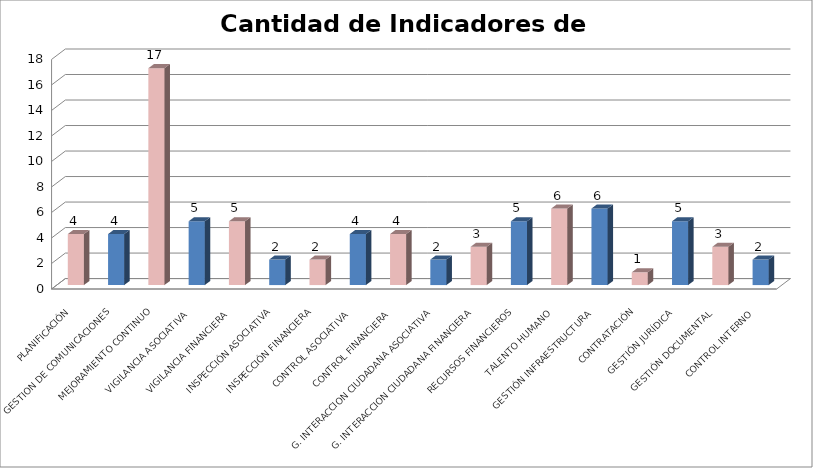
| Category | Series 0 |
|---|---|
| PLANIFICACIÓN | 4 |
| GESTION DE COMUNICACIONES | 4 |
| MEJORAMIENTO CONTINUO | 17 |
| VIGILANCIA ASOCIATIVA | 5 |
| VIGILANCIA FINANCIERA | 5 |
| INSPECCIÓN ASOCIATIVA | 2 |
| INSPECCIÓN FINANCIERA | 2 |
| CONTROL ASOCIATIVA | 4 |
| CONTROL FINANCIERA | 4 |
| G. INTERACCION CIUDADANA ASOCIATIVA | 2 |
| G. INTERACCION CIUDADANA FINANCIERA | 3 |
| RECURSOS FINANCIEROS | 5 |
| TALENTO HUMANO | 6 |
| GESTIÓN INFRAESTRUCTURA | 6 |
| CONTRATACIÓN | 1 |
| GESTIÓN JURÍDICA | 5 |
| GESTIÓN DOCUMENTAL | 3 |
| CONTROL INTERNO | 2 |